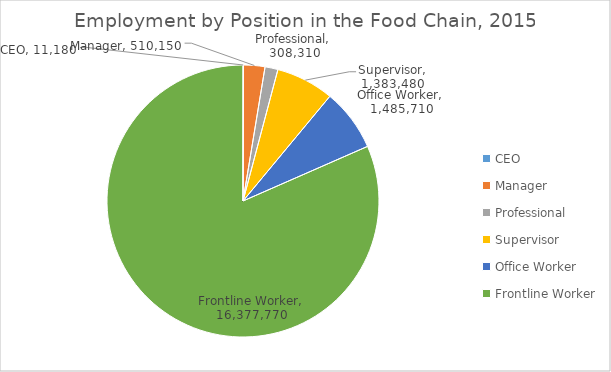
| Category | Series 0 |
|---|---|
| CEO | 11180 |
| Manager | 510150 |
| Professional | 308310 |
| Supervisor | 1383480 |
| Office Worker | 1485710 |
| Frontline Worker | 16377770 |